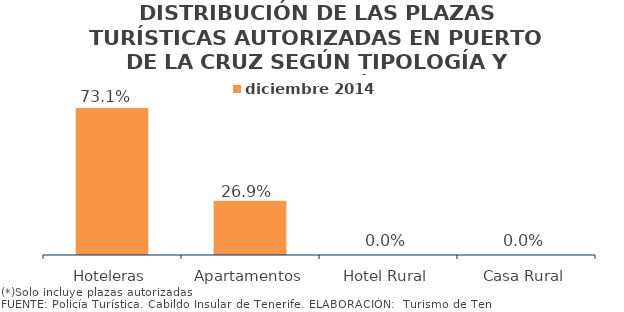
| Category | diciembre 2014 |
|---|---|
| Hoteleras | 0.731 |
| Apartamentos | 0.269 |
| Hotel Rural | 0 |
| Casa Rural | 0 |